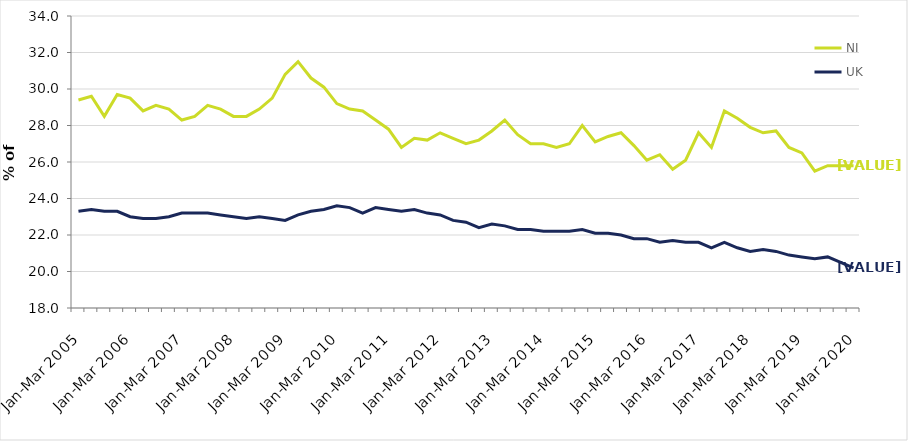
| Category | NI | UK |
|---|---|---|
| Jan-Mar 2005 | 29.4 | 23.3 |
| Apr-Jun 2005 | 29.6 | 23.4 |
| Jul-Sep 2005 | 28.5 | 23.3 |
| Oct-Dec 2005 | 29.7 | 23.3 |
| Jan-Mar 2006 | 29.5 | 23 |
| Apr-Jun 2006 | 28.8 | 22.9 |
| Jul-Sep 2006 | 29.1 | 22.9 |
| Oct-Dec 2006 | 28.9 | 23 |
| Jan-Mar 2007 | 28.3 | 23.2 |
| Apr-Jun 2007 | 28.5 | 23.2 |
| Jul-Sep 2007 | 29.1 | 23.2 |
| Oct-Dec 2007 | 28.9 | 23.1 |
| Jan-Mar 2008 | 28.5 | 23 |
| Apr-Jun 2008 | 28.5 | 22.9 |
| Jul-Sep 2008 | 28.9 | 23 |
| Oct-Dec 2008 | 29.5 | 22.9 |
| Jan-Mar 2009 | 30.8 | 22.8 |
| Apr-Jun 2009 | 31.5 | 23.1 |
| Jul-Sep 2009 | 30.6 | 23.3 |
| Oct-Dec 2009 | 30.1 | 23.4 |
| Jan-Mar 2010 | 29.2 | 23.6 |
| Apr-Jun 2010 | 28.9 | 23.5 |
| Jul-Sep 2010 | 28.8 | 23.2 |
| Oct-Dec 2010 | 28.3 | 23.5 |
| Jan-Mar 2011 | 27.8 | 23.4 |
| Apr-Jun 2011 | 26.8 | 23.3 |
| Jul-Sep 2011 | 27.3 | 23.4 |
| Oct-Dec 2011 | 27.2 | 23.2 |
| Jan-Mar 2012 | 27.6 | 23.1 |
| Apr-Jun 2012 | 27.3 | 22.8 |
| Jul-Sep 2012 | 27 | 22.7 |
| Oct-Dec 2012 | 27.2 | 22.4 |
| Jan-Mar 2013 | 27.7 | 22.6 |
| Apr-Jun 2013 | 28.3 | 22.5 |
| Jul-Sep 2013 | 27.5 | 22.3 |
| Oct-Dec 2013 | 27 | 22.3 |
| Jan-Mar 2014 | 27 | 22.2 |
| Apr-Jun 2014 | 26.8 | 22.2 |
| Jul-Sep 2014 | 27 | 22.2 |
| Oct-Dec 2014 | 28 | 22.3 |
| Jan-Mar 2015 | 27.1 | 22.1 |
| Apr-Jun 2015 | 27.4 | 22.1 |
| Jul-Sep 2015 | 27.6 | 22 |
| Oct-Dec 2015 | 26.9 | 21.8 |
| Jan-Mar 2016 | 26.1 | 21.8 |
| Apr-Jun 2016 | 26.4 | 21.6 |
| Jul-Sep 2016 | 25.6 | 21.7 |
| Oct-Dec 2016 | 26.1 | 21.6 |
| Jan-Mar 2017 | 27.6 | 21.6 |
| Apr-Jun 2017 | 26.8 | 21.3 |
| Jul-Sep 2017 | 28.8 | 21.6 |
| Oct-Dec 2017 | 28.4 | 21.3 |
| Jan-Mar 2018 | 27.9 | 21.1 |
| Apr-Jun 2018 | 27.6 | 21.2 |
| Jul-Sep 2018 | 27.7 | 21.1 |
| Oct-Dec 2018 | 26.8 | 20.9 |
| Jan-Mar 2019 | 26.5 | 20.8 |
| Apr-Jun 2019 | 25.5 | 20.7 |
| Jul-Sep 2019 | 25.8 | 20.8 |
| Oct-Dec 2019 | 25.8 | 20.5 |
| Jan-Mar 2020 | 25.8 | 20.2 |